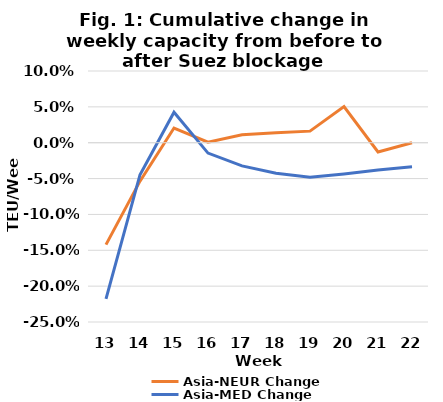
| Category | Asia-NEUR Change | Asia-MED Change |
|---|---|---|
| 13.0 | -0.142 | -0.218 |
| 14.0 | -0.054 | -0.045 |
| 15.0 | 0.02 | 0.042 |
| 16.0 | 0.001 | -0.014 |
| 17.0 | 0.011 | -0.032 |
| 18.0 | 0.014 | -0.043 |
| 19.0 | 0.016 | -0.048 |
| 20.0 | 0.05 | -0.044 |
| 21.0 | -0.013 | -0.038 |
| 22.0 | 0 | -0.034 |